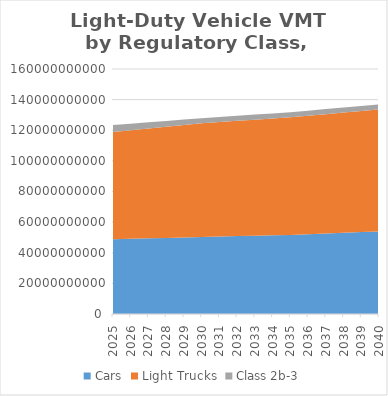
| Category | Cars | Light Trucks | Class 2b-3 |
|---|---|---|---|
| 2025.0 | 48749028149.155 | 70083594939.79 | 4552244368.308 |
| 2026.0 | 49070022391.815 | 70908878964.529 | 4302853379.846 |
| 2027.0 | 49391016634.475 | 71734162989.269 | 4053462391.385 |
| 2028.0 | 49712010877.135 | 72559447014.008 | 3804071402.923 |
| 2029.0 | 50033005119.795 | 73384731038.747 | 3554680414.462 |
| 2030.0 | 50353999362.455 | 74210015063.487 | 3305289426 |
| 2031.0 | 50606567647.023 | 74740041463.495 | 3301087051.074 |
| 2032.0 | 50859135931.59 | 75270067863.503 | 3296884676.148 |
| 2033.0 | 51111704216.158 | 75800094263.512 | 3292682301.221 |
| 2034.0 | 51364272500.725 | 76330120663.52 | 3288479926.295 |
| 2035.0 | 51616840785.293 | 76860147063.528 | 3284277551.369 |
| 2036.0 | 52084269378.435 | 77416449722.511 | 3280383203.895 |
| 2037.0 | 52551697971.578 | 77972752381.494 | 3276488856.421 |
| 2038.0 | 53019126564.72 | 78529055040.476 | 3272594508.948 |
| 2039.0 | 53486555157.863 | 79085357699.459 | 3268700161.474 |
| 2040.0 | 53953983751.005 | 79641660358.442 | 3264805814 |